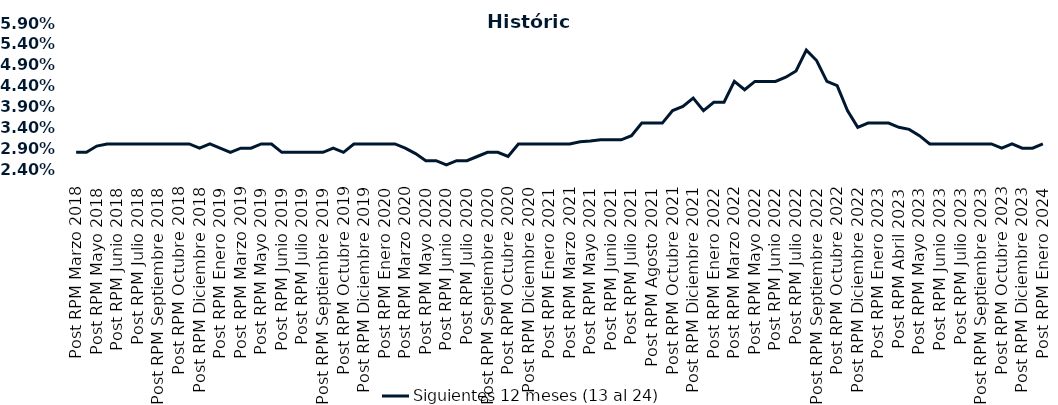
| Category | Siguientes 12 meses (13 al 24)  |
|---|---|
| Post RPM Marzo 2018 | 0.028 |
| Pre RPM Mayo 2018 | 0.028 |
| Post RPM Mayo 2018 | 0.03 |
| Pre RPM Junio 2018 | 0.03 |
| Post RPM Junio 2018 | 0.03 |
| Pre RPM Julio 2018 | 0.03 |
| Post RPM Julio 2018 | 0.03 |
| Pre RPM Septiembre 2018 | 0.03 |
| Post RPM Septiembre 2018 | 0.03 |
| Pre RPM Octubre 2018 | 0.03 |
| Post RPM Octubre 2018 | 0.03 |
| Pre RPM Diciembre 2018 | 0.03 |
| Post RPM Diciembre 2018 | 0.029 |
| Pre RPM Enero 2019 | 0.03 |
| Post RPM Enero 2019 | 0.029 |
| Pre RPM Marzo 2019 | 0.028 |
| Post RPM Marzo 2019 | 0.029 |
| Pre RPM Mayo 2019 | 0.029 |
| Post RPM Mayo 2019 | 0.03 |
| Pre RPM Junio 2019 | 0.03 |
| Post RPM Junio 2019 | 0.028 |
| Pre RPM Julio 2019 | 0.028 |
| Post RPM Julio 2019 | 0.028 |
| Pre RPM Septiembre 2019 | 0.028 |
| Post RPM Septiembre 2019 | 0.028 |
| Pre RPM Octubre 2019 | 0.029 |
| Post RPM Octubre 2019 | 0.028 |
| Pre RPM Diciembre 2019 | 0.03 |
| Post RPM Diciembre 2019 | 0.03 |
| Pre RPM Enero 2020 | 0.03 |
| Post RPM Enero 2020 | 0.03 |
| Pre RPM Marzo 2020 | 0.03 |
| Post RPM Marzo 2020 | 0.029 |
| Pre RPM Mayo 2020 | 0.028 |
| Post RPM Mayo 2020 | 0.026 |
| Pre RPM Junio 2020 | 0.026 |
| Post RPM Junio 2020 | 0.025 |
| Pre RPM Julio 2020 | 0.026 |
| Post RPM Julio 2020 | 0.026 |
| Pre RPM Septiembre 2020 | 0.027 |
| Post RPM Septiembre 2020 | 0.028 |
| Pre RPM Octubre 2020 | 0.028 |
| Post RPM Octubre 2020 | 0.027 |
| Pre RPM Diciembre 2020 | 0.03 |
| Post RPM Diciembre 2020 | 0.03 |
| Pre RPM Enero 2021 | 0.03 |
| Post RPM Enero 2021 | 0.03 |
| Pre RPM Marzo 2021 | 0.03 |
| Post RPM Marzo 2021 | 0.03 |
| Pre RPM Mayo 2021 | 0.031 |
| Post RPM Mayo 2021 | 0.031 |
| Pre RPM Junio 2021 | 0.031 |
| Post RPM Junio 2021 | 0.031 |
| Pre RPM Julio 2021 | 0.031 |
| Post RPM Julio 2021 | 0.032 |
| Pre RPM Agosto 2021 | 0.035 |
| Post RPM Agosto 2021 | 0.035 |
| Pre RPM Octubre 2021 | 0.035 |
| Post RPM Octubre 2021 | 0.038 |
| Pre RPM Diciembre 2021 | 0.039 |
| Post RPM Diciembre 2021 | 0.041 |
| Pre RPM Enero 2022 | 0.038 |
| Post RPM Enero 2022 | 0.04 |
| Pre RPM Marzo 2022 | 0.04 |
| Post RPM Marzo 2022 | 0.045 |
| Pre RPM Mayo 2022 | 0.043 |
| Post RPM Mayo 2022 | 0.045 |
| Pre RPM Junio 2022 | 0.045 |
| Post RPM Junio 2022 | 0.045 |
| Pre RPM Julio 2022 | 0.046 |
| Post RPM Julio 2022 | 0.048 |
| Pre RPM Septiembre 2022 | 0.052 |
| Post RPM Septiembre 2022 | 0.05 |
| Pre RPM Octubre 2022 | 0.045 |
| Post RPM Octubre 2022 | 0.044 |
| Pre RPM Diciembre 2022 | 0.038 |
| Post RPM Diciembre 2022 | 0.034 |
| Pre RPM Enero 2023 | 0.035 |
| Post RPM Enero 2023 | 0.035 |
| Pre RPM Abril 2023 | 0.035 |
| Post RPM Abril 2023 | 0.034 |
| Pre RPM Mayo 2023 | 0.034 |
| Post RPM Mayo 2023 | 0.032 |
| Pre RPM Junio 2023 | 0.03 |
| Post RPM Junio 2023 | 0.03 |
| Pre RPM Julio 2023 | 0.03 |
| Post RPM Julio 2023 | 0.03 |
| Pre RPM Septiembre 2023 | 0.03 |
| Post RPM Septiembre 2023 | 0.03 |
| Pre RPM Octubre 2023 | 0.03 |
| Post RPM Octubre 2023 | 0.029 |
| Pre RPM Diciembre 2023 | 0.03 |
| Post RPM Diciembre 2023 | 0.029 |
| Pre RPM Enero 2024 | 0.029 |
| Post RPM Enero 2024 | 0.03 |